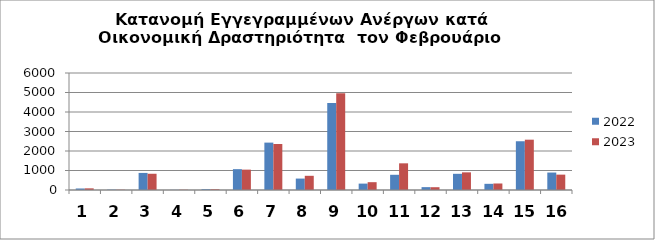
| Category | 2022 | 2023 |
|---|---|---|
| 0 | 78 | 85 |
| 1 | 19 | 14 |
| 2 | 876 | 833 |
| 3 | 8 | 13 |
| 4 | 41 | 38 |
| 5 | 1069 | 1044 |
| 6 | 2430 | 2360 |
| 7 | 586 | 728 |
| 8 | 4460 | 4963 |
| 9 | 328 | 401 |
| 10 | 780 | 1368 |
| 11 | 147 | 143 |
| 12 | 830 | 905 |
| 13 | 317 | 334 |
| 14 | 2500 | 2580 |
| 15 | 895 | 788 |